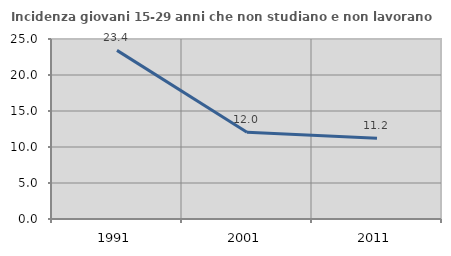
| Category | Incidenza giovani 15-29 anni che non studiano e non lavorano  |
|---|---|
| 1991.0 | 23.419 |
| 2001.0 | 12.037 |
| 2011.0 | 11.23 |